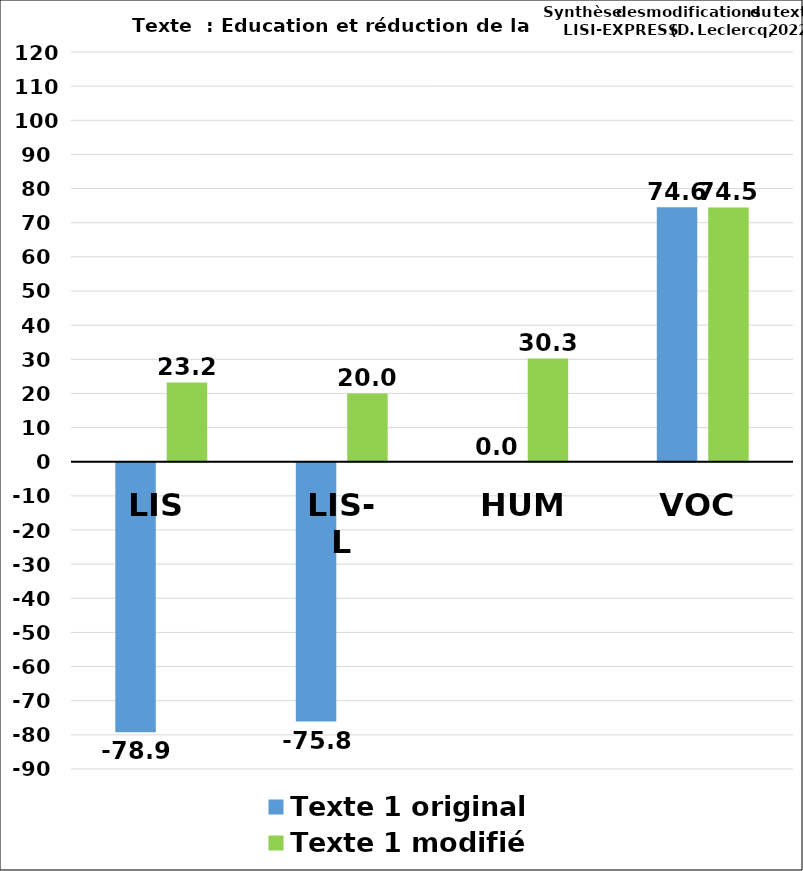
| Category | Texte 1 original  | Texte 1 modifié |
|---|---|---|
| LIS | -78.947 | 23.227 |
| LIS-L | -75.814 | 19.983 |
| HUM | 0 | 30.26 |
| VOC | 74.561 | 74.468 |